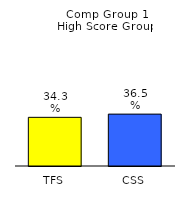
| Category | Series 0 |
|---|---|
| TFS | 0.343 |
| CSS | 0.365 |